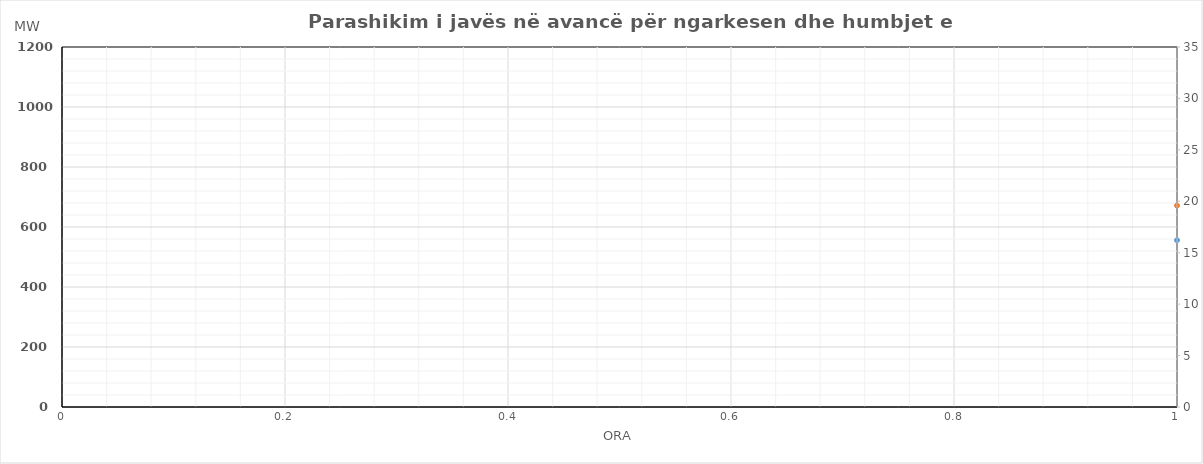
| Category | Ngarkesa (MWh) |
|---|---|
| 0 | 671.39 |
| 1 | 608.49 |
| 2 | 573.67 |
| 3 | 557.28 |
| 4 | 556.95 |
| 5 | 583.78 |
| 6 | 667.1 |
| 7 | 776.41 |
| 8 | 872.21 |
| 9 | 915.11 |
| 10 | 928.2 |
| 11 | 945.16 |
| 12 | 960.39 |
| 13 | 945.76 |
| 14 | 937.73 |
| 15 | 928.94 |
| 16 | 932.01 |
| 17 | 960.71 |
| 18 | 983.86 |
| 19 | 985.66 |
| 20 | 1016.14 |
| 21 | 981.63 |
| 22 | 882.52 |
| 23 | 758.6 |
| 24 | 691.91 |
| 25 | 626.43 |
| 26 | 589.8 |
| 27 | 569.78 |
| 28 | 566.22 |
| 29 | 592.03 |
| 30 | 668.84 |
| 31 | 779.39 |
| 32 | 865.97 |
| 33 | 900.37 |
| 34 | 914.18 |
| 35 | 920.72 |
| 36 | 888.69 |
| 37 | 899.7 |
| 38 | 888.1 |
| 39 | 875.78 |
| 40 | 880.12 |
| 41 | 908.9 |
| 42 | 940.87 |
| 43 | 966.59 |
| 44 | 1010.71 |
| 45 | 957.71 |
| 46 | 855.93 |
| 47 | 738.34 |
| 48 | 621.61 |
| 49 | 567.01 |
| 50 | 537.53 |
| 51 | 522.67 |
| 52 | 523.23 |
| 53 | 552.95 |
| 54 | 639.96 |
| 55 | 756.11 |
| 56 | 841.18 |
| 57 | 874.41 |
| 58 | 887.14 |
| 59 | 889.35 |
| 60 | 890.71 |
| 61 | 869.8 |
| 62 | 857.07 |
| 63 | 841.71 |
| 64 | 844.89 |
| 65 | 876.53 |
| 66 | 910.9 |
| 67 | 952.13 |
| 68 | 985.33 |
| 69 | 944.18 |
| 70 | 841.3 |
| 71 | 727.41 |
| 72 | 603.7 |
| 73 | 551 |
| 74 | 523.91 |
| 75 | 509.89 |
| 76 | 510.28 |
| 77 | 537.27 |
| 78 | 627.46 |
| 79 | 742.7 |
| 80 | 822.71 |
| 81 | 855.1 |
| 82 | 864.92 |
| 83 | 878.1 |
| 84 | 881.01 |
| 85 | 887.61 |
| 86 | 873.2 |
| 87 | 863.48 |
| 88 | 860.09 |
| 89 | 884.88 |
| 90 | 911.38 |
| 91 | 931.9 |
| 92 | 973.57 |
| 93 | 925.56 |
| 94 | 830.77 |
| 95 | 722.18 |
| 96 | 619.61 |
| 97 | 563.16 |
| 98 | 532.72 |
| 99 | 518.99 |
| 100 | 518.98 |
| 101 | 546.16 |
| 102 | 629.89 |
| 103 | 749.87 |
| 104 | 833.3 |
| 105 | 863.21 |
| 106 | 873.71 |
| 107 | 890.98 |
| 108 | 871.15 |
| 109 | 875.68 |
| 110 | 858.95 |
| 111 | 839.69 |
| 112 | 838.91 |
| 113 | 868.3 |
| 114 | 917.19 |
| 115 | 939.32 |
| 116 | 981.17 |
| 117 | 923.46 |
| 118 | 822.74 |
| 119 | 715.67 |
| 120 | 664.77 |
| 121 | 604.83 |
| 122 | 571.22 |
| 123 | 554.54 |
| 124 | 552.61 |
| 125 | 579.03 |
| 126 | 643.7 |
| 127 | 743.18 |
| 128 | 830.99 |
| 129 | 872.82 |
| 130 | 888.49 |
| 131 | 894.41 |
| 132 | 883.2 |
| 133 | 874.62 |
| 134 | 852.08 |
| 135 | 826.1 |
| 136 | 822.66 |
| 137 | 827 |
| 138 | 853.83 |
| 139 | 877.62 |
| 140 | 917.08 |
| 141 | 877.42 |
| 142 | 781.85 |
| 143 | 678.64 |
| 144 | 644.97 |
| 145 | 579.33 |
| 146 | 548.32 |
| 147 | 532.74 |
| 148 | 533.11 |
| 149 | 553.33 |
| 150 | 607.4 |
| 151 | 683.68 |
| 152 | 752.69 |
| 153 | 786.92 |
| 154 | 819.59 |
| 155 | 853.11 |
| 156 | 866.4 |
| 157 | 850.02 |
| 158 | 818.78 |
| 159 | 806.6 |
| 160 | 823.56 |
| 161 | 863 |
| 162 | 907.13 |
| 163 | 940.52 |
| 164 | 985.88 |
| 165 | 959.67 |
| 166 | 854.2 |
| 167 | 740.59 |